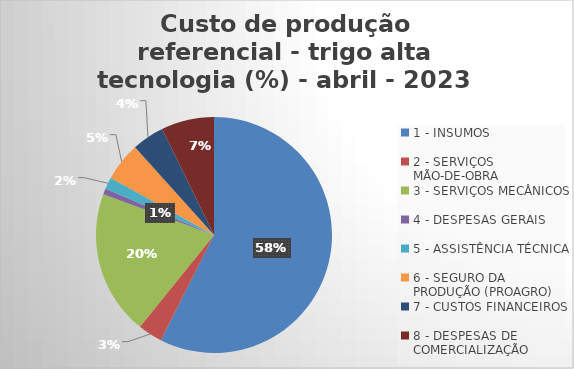
| Category | Series 0 |
|---|---|
| 1 - INSUMOS | 57.444 |
| 2 - SERVIÇOS MÃO-DE-OBRA | 3.361 |
| 3 - SERVIÇOS MECÂNICOS | 19.802 |
| 4 - DESPESAS GERAIS  | 0.806 |
| 5 - ASSISTÊNCIA TÉCNICA | 1.628 |
| 6 - SEGURO DA PRODUÇÃO (PROAGRO) | 5.292 |
| 7 - CUSTOS FINANCEIROS | 4.417 |
| 8 - DESPESAS DE COMERCIALIZAÇÃO | 7.25 |